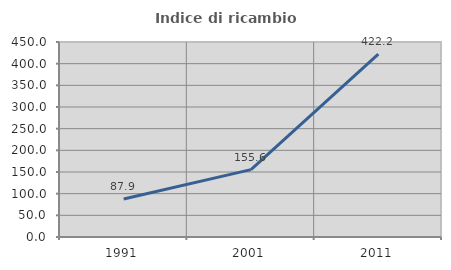
| Category | Indice di ricambio occupazionale  |
|---|---|
| 1991.0 | 87.879 |
| 2001.0 | 155.556 |
| 2011.0 | 422.222 |